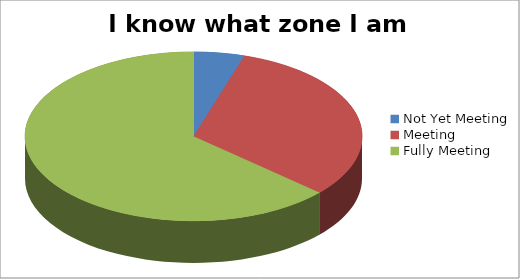
| Category | I know what zone I am in |
|---|---|
| Not Yet Meeting | 2 |
| Meeting | 13 |
| Fully Meeting | 26 |